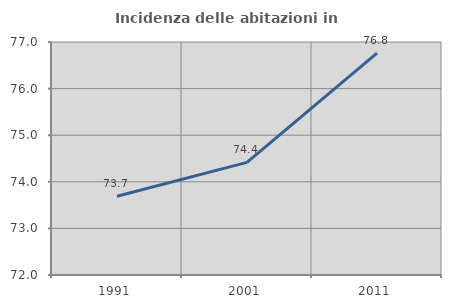
| Category | Incidenza delle abitazioni in proprietà  |
|---|---|
| 1991.0 | 73.69 |
| 2001.0 | 74.417 |
| 2011.0 | 76.76 |